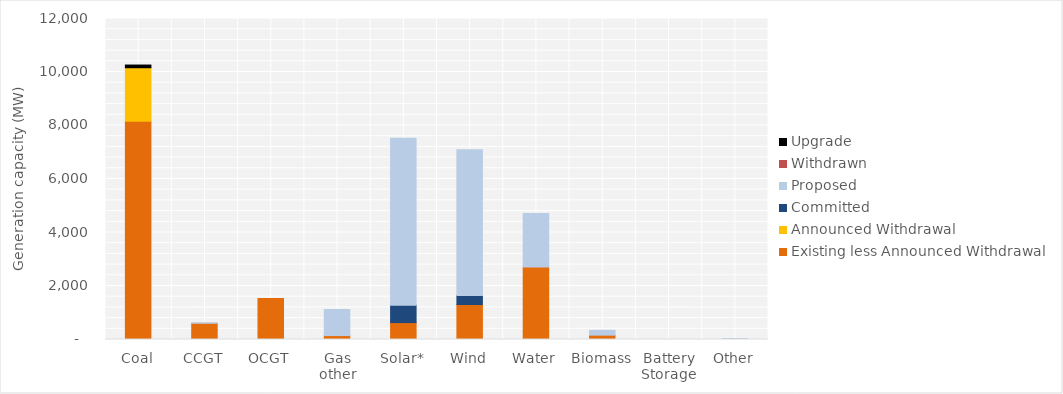
| Category | Existing less Announced Withdrawal | Announced Withdrawal | Committed | Proposed | Withdrawn | Upgrade |
|---|---|---|---|---|---|---|
| Coal | 8160 | 2000 | 0 | 0 | 0 | 100 |
| CCGT | 605.9 | 0 | 0 | 15 | 0 | 0 |
| OCGT | 1530 | 0 | 0 | 0 | 0 | 0 |
| Gas other | 147.268 | 0 | 0 | 975 | 0 | 0 |
| Solar* | 632.023 | 0 | 652.4 | 6234.9 | 0 | 0 |
| Wind | 1307 | 0 | 339.19 | 5444.52 | 0 | 0 |
| Water | 2706.1 | 0 | 0 | 2000 | 0 | 0 |
| Biomass | 162.874 | 0 | 0 | 180.6 | 0 | 0 |
| Battery Storage | 0 | 0 | 0 | 0 | 0 | 0 |
| Other | 9.13 | 0 | 0 | 28.8 | 0 | 0 |